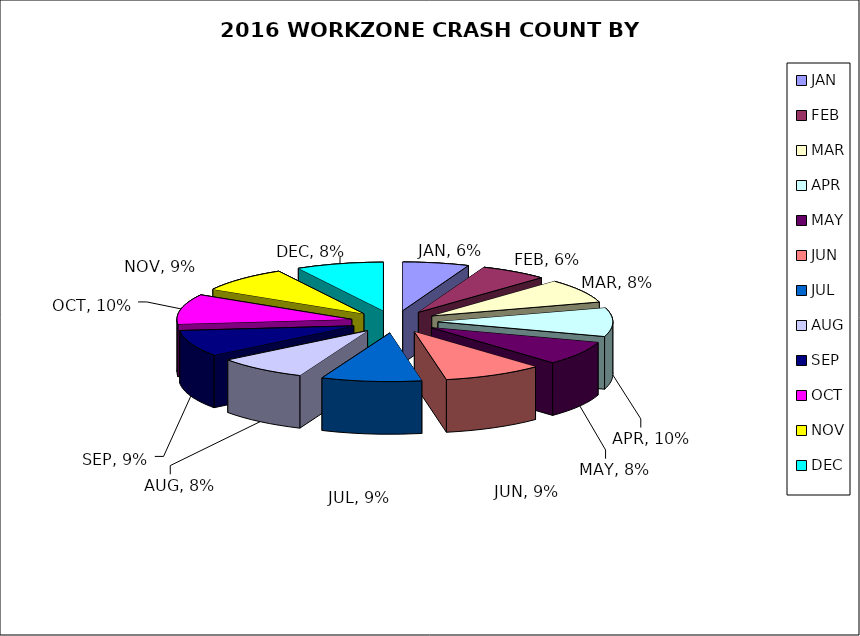
| Category | Month |
|---|---|
| JAN | 0.061 |
| FEB | 0.063 |
| MAR | 0.08 |
| APR | 0.095 |
| MAY | 0.079 |
| JUN | 0.093 |
| JUL | 0.093 |
| AUG | 0.084 |
| SEP | 0.087 |
| OCT | 0.099 |
| NOV | 0.085 |
| DEC | 0.081 |